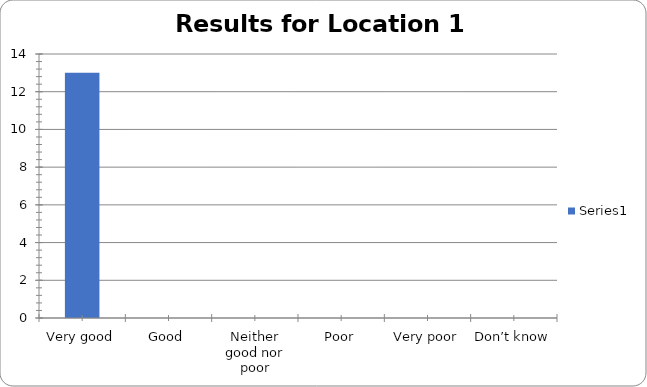
| Category | Series 0 |
|---|---|
| Very good | 13 |
| Good | 0 |
| Neither good nor poor | 0 |
| Poor | 0 |
| Very poor | 0 |
| Don’t know | 0 |